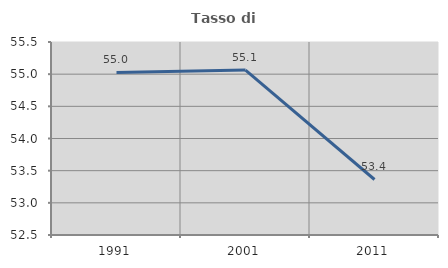
| Category | Tasso di occupazione   |
|---|---|
| 1991.0 | 55.027 |
| 2001.0 | 55.063 |
| 2011.0 | 53.363 |